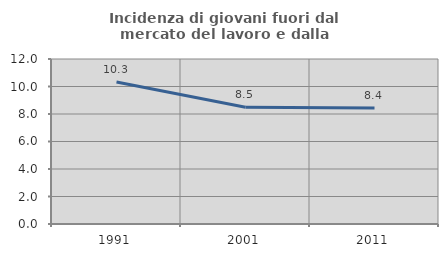
| Category | Incidenza di giovani fuori dal mercato del lavoro e dalla formazione  |
|---|---|
| 1991.0 | 10.328 |
| 2001.0 | 8.493 |
| 2011.0 | 8.435 |